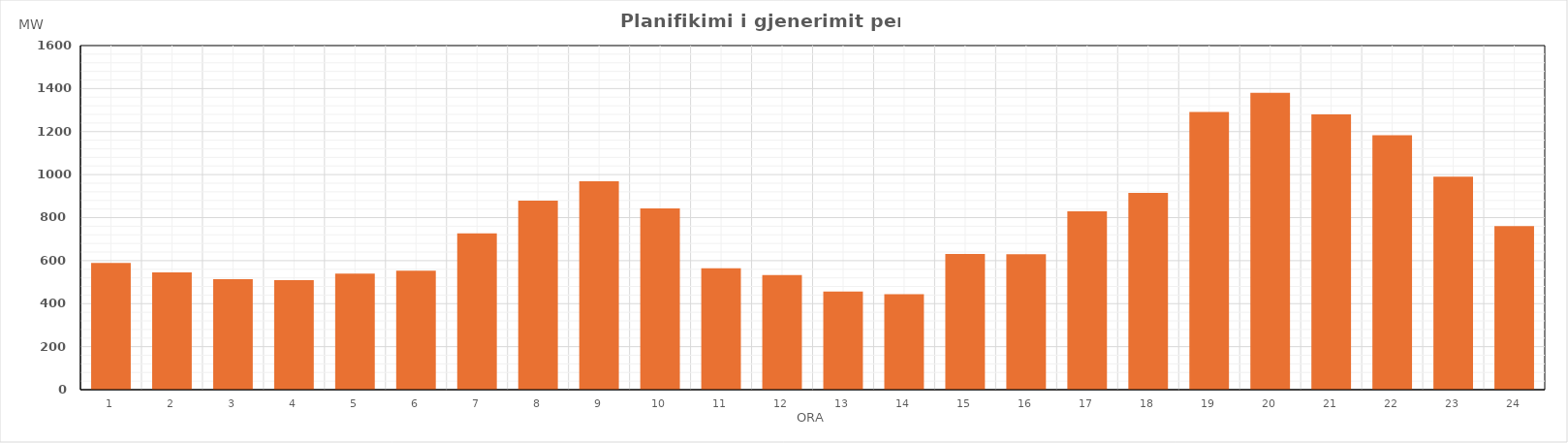
| Category | Max (MW) |
|---|---|
| 0 | 589.55 |
| 1 | 545.61 |
| 2 | 513.57 |
| 3 | 509.35 |
| 4 | 539.27 |
| 5 | 553.03 |
| 6 | 727.04 |
| 7 | 878.86 |
| 8 | 968.53 |
| 9 | 842.6 |
| 10 | 564.43 |
| 11 | 533.12 |
| 12 | 456.57 |
| 13 | 443.98 |
| 14 | 631.42 |
| 15 | 629.69 |
| 16 | 828.74 |
| 17 | 914.41 |
| 18 | 1291.7 |
| 19 | 1380.79 |
| 20 | 1279.97 |
| 21 | 1183.61 |
| 22 | 989.9 |
| 23 | 760.19 |